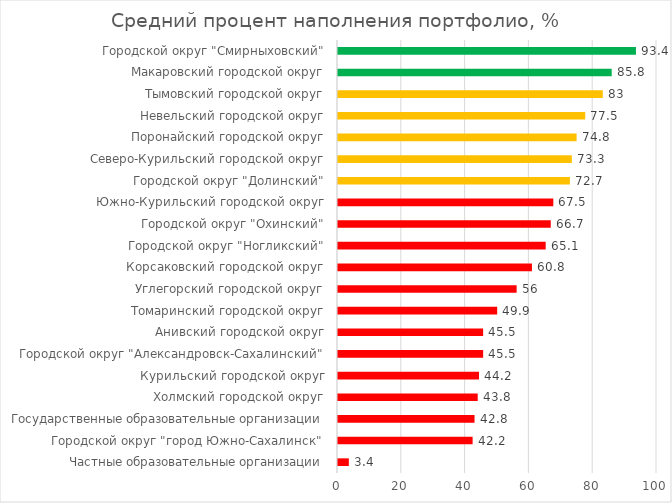
| Category | Средний процент наполнения портфолио, % |
|---|---|
| Частные образовательные организации | 3.4 |
| Городской округ "город Южно-Сахалинск" | 42.2 |
| Государственные образовательные организации | 42.8 |
| Холмский городской округ | 43.8 |
| Курильский городской округ | 44.2 |
| Городской округ "Александровск-Сахалинский" | 45.5 |
| Анивский городской округ | 45.5 |
| Томаринский городской округ | 49.9 |
| Углегорский городской округ | 56 |
| Корсаковский городской округ | 60.8 |
| Городской округ "Ногликский" | 65.1 |
| Городской округ "Охинский" | 66.7 |
| Южно-Курильский городской округ | 67.5 |
| Городской округ "Долинский" | 72.7 |
| Северо-Курильский городской округ | 73.3 |
| Поронайский городской округ | 74.8 |
| Невельский городской округ | 77.5 |
| Тымовский городской округ | 83 |
| Макаровский городской округ | 85.8 |
| Городской округ "Смирныховский" | 93.4 |